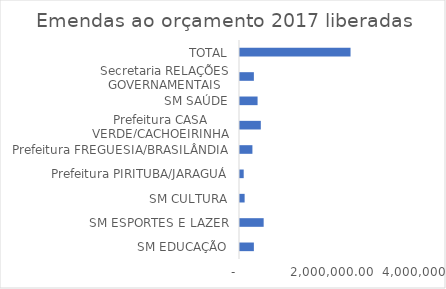
| Category | Series 0 |
|---|---|
| SM EDUCAÇÃO | 300000 |
| SM ESPORTES E LAZER | 511587.33 |
| SM CULTURA | 100000 |
| Prefeitura PIRITUBA/JARAGUÁ | 80000 |
| Prefeitura FREGUESIA/BRASILÂNDIA | 268411.67 |
| Prefeitura CASA VERDE/CACHOEIRINHA | 450000 |
| SM SAÚDE | 380000 |
| Secretaria RELAÇÕES GOVERNAMENTAIS | 300000 |
| TOTAL | 2389999 |